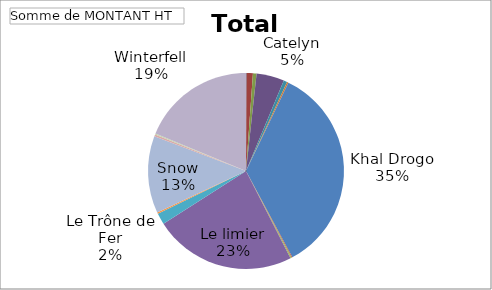
| Category | Total |
|---|---|
| Arya | 324 |
| Barathéon | 3892.22 |
| Castral Roc | 2213.75 |
| Catelyn | 17072 |
| Daenerys Targaryen | 2136.75 |
| Joffrey | 884.5 |
| Khal Drogo | 130520.283 |
| Lannister | 492.48 |
| Le Corbeau | 741 |
| Le limier | 87328.453 |
| Le Trône de Fer | 6913 |
| Sansa | 927.42 |
| Snow | 47312.002 |
| Stark | 1228.92 |
| Tyrion | 601.8 |
| Winterfell | 69856 |